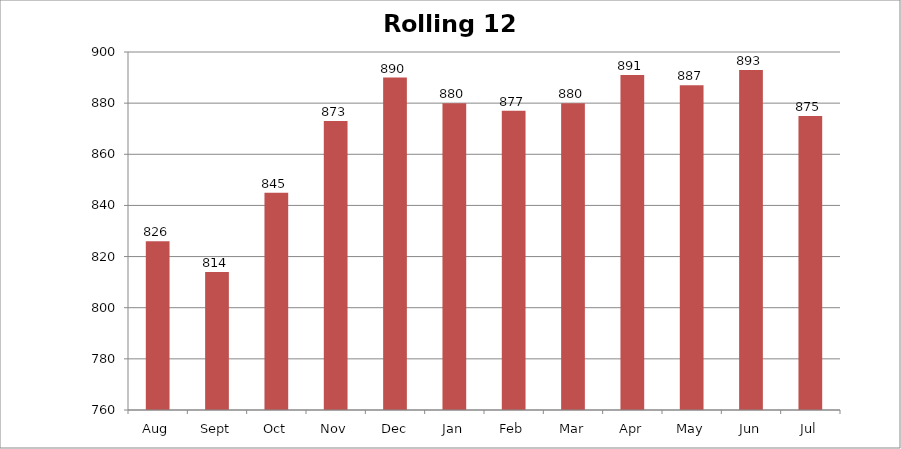
| Category | Rolling 12 Month |
|---|---|
| Aug | 826 |
| Sept | 814 |
| Oct | 845 |
| Nov | 873 |
| Dec | 890 |
| Jan | 880 |
| Feb | 877 |
| Mar | 880 |
| Apr | 891 |
| May | 887 |
| Jun | 893 |
| Jul | 875 |